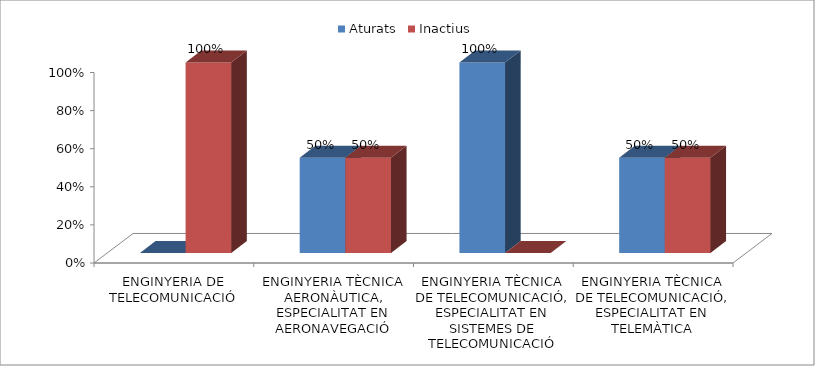
| Category | Aturats | Inactius |
|---|---|---|
| ENGINYERIA DE TELECOMUNICACIÓ | 0 | 1 |
| ENGINYERIA TÈCNICA AERONÀUTICA, ESPECIALITAT EN AERONAVEGACIÓ | 0.5 | 0.5 |
| ENGINYERIA TÈCNICA DE TELECOMUNICACIÓ, ESPECIALITAT EN SISTEMES DE TELECOMUNICACIÓ | 1 | 0 |
| ENGINYERIA TÈCNICA DE TELECOMUNICACIÓ, ESPECIALITAT EN TELEMÀTICA | 0.5 | 0.5 |